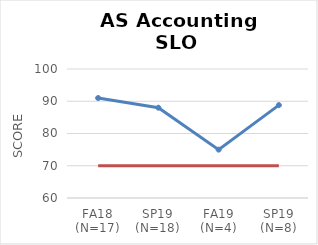
| Category | Series 0 | Series 1 |
|---|---|---|
| FA18 (N=17) | 91 | 70 |
| SP19 (N=18) | 88 | 70 |
| FA19 (N=4) | 75 | 70 |
| SP19 (N=8) | 88.8 | 70 |